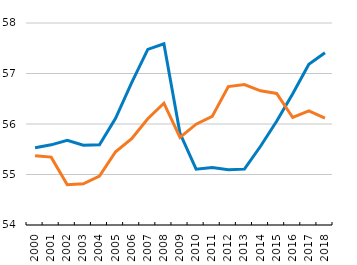
| Category | Advanced | Emerging-market economies |
|---|---|---|
| 2000.0 | 55.53 | 55.371 |
| 2001.0 | 55.587 | 55.344 |
| 2002.0 | 55.675 | 54.798 |
| 2003.0 | 55.579 | 54.815 |
| 2004.0 | 55.588 | 54.967 |
| 2005.0 | 56.114 | 55.451 |
| 2006.0 | 56.822 | 55.711 |
| 2007.0 | 57.477 | 56.104 |
| 2008.0 | 57.588 | 56.412 |
| 2009.0 | 55.816 | 55.733 |
| 2010.0 | 55.106 | 55.996 |
| 2011.0 | 55.14 | 56.151 |
| 2012.0 | 55.095 | 56.74 |
| 2013.0 | 55.106 | 56.782 |
| 2014.0 | 55.559 | 56.657 |
| 2015.0 | 56.055 | 56.604 |
| 2016.0 | 56.597 | 56.129 |
| 2017.0 | 57.182 | 56.262 |
| 2018.0 | 57.41 | 56.118 |